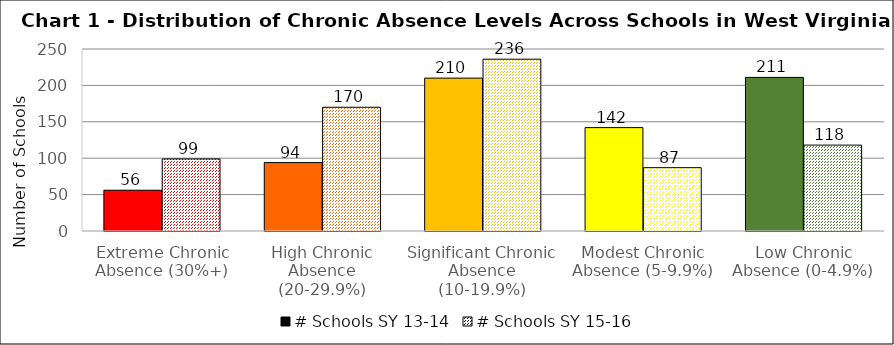
| Category | # Schools SY 13-14 | # Schools SY 15-16 |
|---|---|---|
| Extreme Chronic Absence (30%+) | 56 | 99 |
| High Chronic Absence (20-29.9%) | 94 | 170 |
| Significant Chronic Absence (10-19.9%) | 210 | 236 |
| Modest Chronic Absence (5-9.9%) | 142 | 87 |
| Low Chronic Absence (0-4.9%) | 211 | 118 |